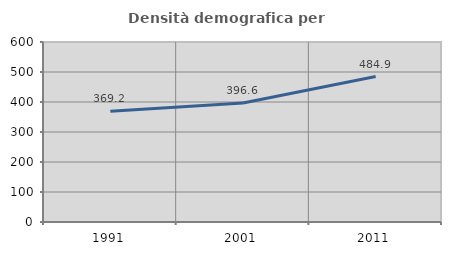
| Category | Densità demografica |
|---|---|
| 1991.0 | 369.204 |
| 2001.0 | 396.604 |
| 2011.0 | 484.938 |